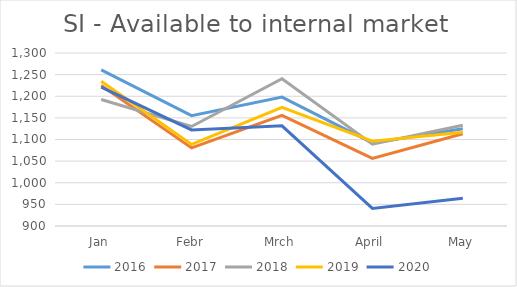
| Category | 2016 | 2017 | 2018 | 2019 | 2020 |
|---|---|---|---|---|---|
| Jan | 1261 | 1224.784 | 1192.617 | 1234.858 | 1221.044 |
| Febr | 1155 | 1080.615 | 1130.128 | 1088.714 | 1122.232 |
| Mrch | 1198 | 1155.908 | 1240.659 | 1174.146 | 1131.501 |
| April | 1092 | 1056.259 | 1089.227 | 1096.247 | 940.506 |
| May | 1125 | 1113.236 | 1132.984 | 1117.008 | 964.279 |